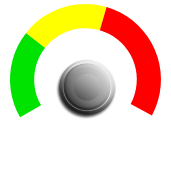
| Category | PIE |
|---|---|
| 0 | 12 |
| 1 | 0.28 |
| 2 | 8.72 |